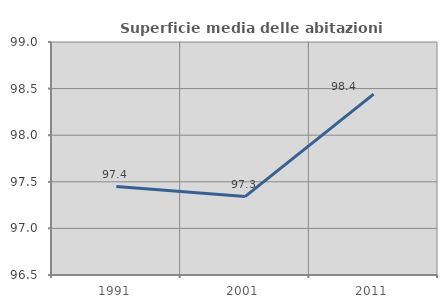
| Category | Superficie media delle abitazioni occupate |
|---|---|
| 1991.0 | 97.449 |
| 2001.0 | 97.341 |
| 2011.0 | 98.441 |